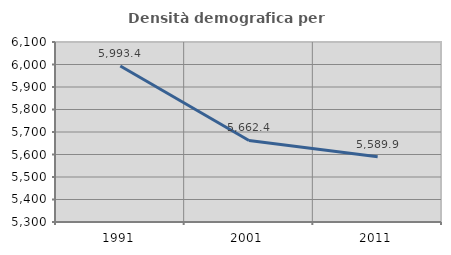
| Category | Densità demografica |
|---|---|
| 1991.0 | 5993.414 |
| 2001.0 | 5662.394 |
| 2011.0 | 5589.934 |